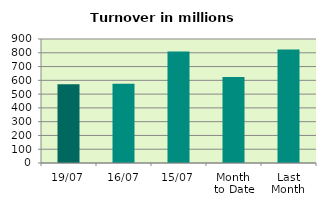
| Category | Series 0 |
|---|---|
| 19/07 | 571.616 |
| 16/07 | 574.454 |
| 15/07 | 809.747 |
| Month 
to Date | 624.627 |
| Last
Month | 824.124 |